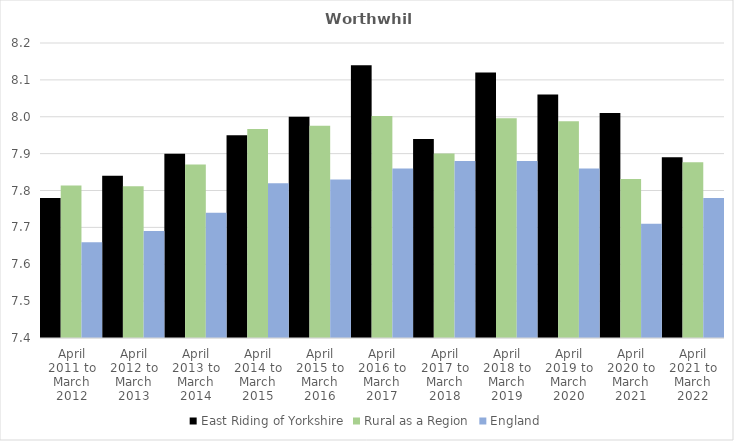
| Category | East Riding of Yorkshire | Rural as a Region | England |
|---|---|---|---|
| April 2011 to March 2012 | 7.78 | 7.813 | 7.66 |
| April 2012 to March 2013 | 7.84 | 7.811 | 7.69 |
| April 2013 to March 2014 | 7.9 | 7.871 | 7.74 |
| April 2014 to March 2015 | 7.95 | 7.967 | 7.82 |
| April 2015 to March 2016 | 8 | 7.975 | 7.83 |
| April 2016 to March 2017 | 8.14 | 8.002 | 7.86 |
| April 2017 to March 2018 | 7.94 | 7.9 | 7.88 |
| April 2018 to March 2019 | 8.12 | 7.996 | 7.88 |
| April 2019 to March 2020 | 8.06 | 7.988 | 7.86 |
| April 2020 to March 2021 | 8.01 | 7.831 | 7.71 |
| April 2021 to March 2022 | 7.89 | 7.877 | 7.78 |